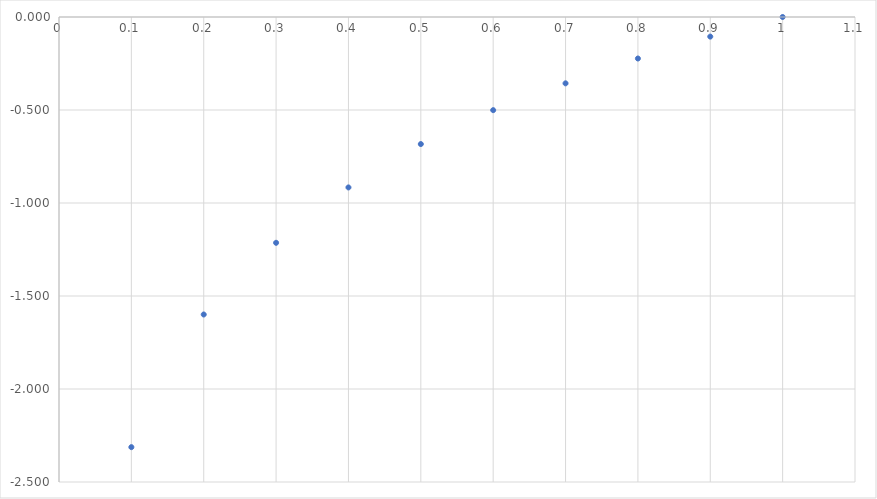
| Category | y |
|---|---|
| 0.1 | -2.313 |
| 0.2 | -1.599 |
| 0.30000000000000004 | -1.214 |
| 0.4 | -0.916 |
| 0.5 | -0.683 |
| 0.6 | -0.501 |
| 0.7 | -0.357 |
| 0.7999999999999999 | -0.223 |
| 0.8999999999999999 | -0.105 |
| 0.9999999999999999 | 0 |